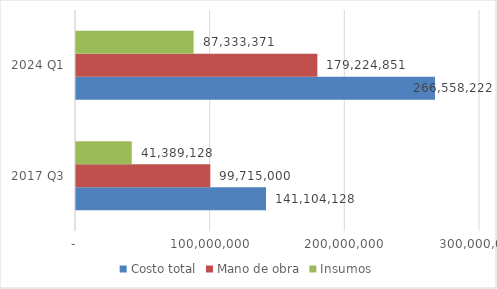
| Category | Costo total | Mano de obra | Insumos |
|---|---|---|---|
| 2017 Q3 | 141104128 | 99715000 | 41389128 |
| 2024 Q1 | 266558221.786 | 179224851 | 87333370.786 |